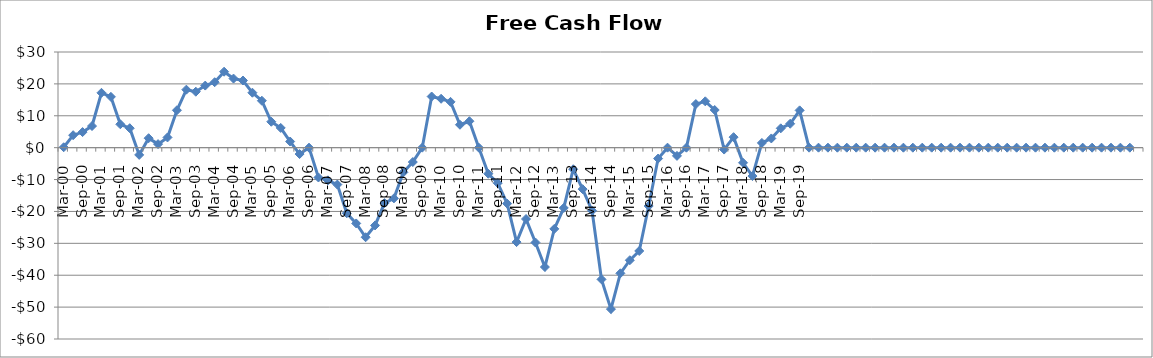
| Category | Series 0 |
|---|---|
| Mar-00 | 0.128 |
| Jun-00 | 3.91 |
| Sep-00 | 4.885 |
| Dec-00 | 6.784 |
| Mar-01 | 17.2 |
| Jun-01 | 15.934 |
| Sep-01 | 7.339 |
| Dec-01 | 6.1 |
| Mar-02 | -2.268 |
| Jun-02 | 2.972 |
| Sep-02 | 1.116 |
| Dec-02 | 3.206 |
| Mar-03 | 11.732 |
| Jun-03 | 18.19 |
| Sep-03 | 17.546 |
| Dec-03 | 19.469 |
| Mar-04 | 20.528 |
| Jun-04 | 23.822 |
| Sep-04 | 21.663 |
| Dec-04 | 21.06 |
| Mar-05 | 17.236 |
| Jun-05 | 14.719 |
| Sep-05 | 8.128 |
| Dec-05 | 6.193 |
| Mar-06 | 1.924 |
| Jun-06 | -2.003 |
| Sep-06 | 0 |
| Dec-06 | -9.353 |
| Mar-07 | -10.256 |
| Jun-07 | -11.573 |
| Sep-07 | -20.568 |
| Dec-07 | -23.761 |
| Mar-08 | -28.088 |
| Jun-08 | -24.388 |
| Sep-08 | -17.384 |
| Dec-08 | -15.896 |
| Mar-09 | -7.741 |
| Jun-09 | -4.508 |
| Sep-09 | 0 |
| Dec-09 | 16.04 |
| Mar-10 | 15.331 |
| Jun-10 | 14.36 |
| Sep-10 | 7.182 |
| Dec-10 | 8.291 |
| Mar-11 | 0 |
| Jun-11 | -8.174 |
| Sep-11 | -11.119 |
| Dec-11 | -17.536 |
| Mar-12 | -29.609 |
| Jun-12 | -22.374 |
| Sep-12 | -29.746 |
| Dec-12 | -37.427 |
| Mar-13 | -25.466 |
| Jun-13 | -18.9 |
| Sep-13 | -6.763 |
| Dec-13 | -13.005 |
| Mar-14 | -19.766 |
| Jun-14 | -41.3 |
| Sep-14 | -50.63 |
| Dec-14 | -39.404 |
| Mar-15 | -35.3 |
| Jun-15 | -32.4 |
| Sep-15 | -18.295 |
| Dec-15 | -3.42 |
| Mar-16 | 0 |
| Jun-16 | -2.574 |
| Sep-16 | 0 |
| Dec-16 | 13.671 |
| Mar-17 | 14.533 |
| Jun-17 | 11.811 |
| Sep-17 | -0.591 |
| Dec-17 | 3.292 |
| Mar-18 | -4.736 |
| Jun-18 | -8.91 |
| Sep-18 | 1.489 |
| Dec-18 | 2.892 |
| Mar-19 | 6.066 |
| Jun-19 | 7.5 |
| Sep-19 | 11.695 |